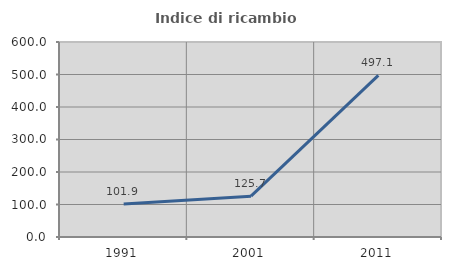
| Category | Indice di ricambio occupazionale  |
|---|---|
| 1991.0 | 101.905 |
| 2001.0 | 125.664 |
| 2011.0 | 497.059 |